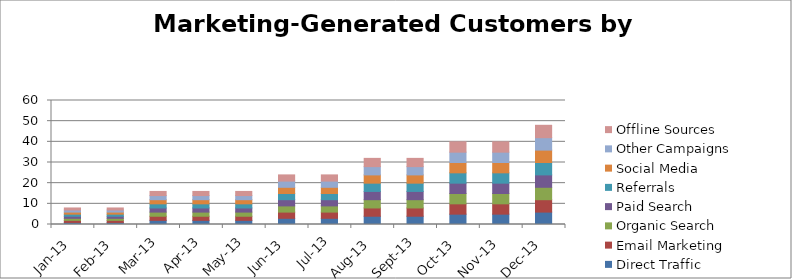
| Category | Direct Traffic | Email Marketing | Organic Search | Paid Search | Referrals | Social Media | Other Campaigns | Offline Sources |
|---|---|---|---|---|---|---|---|---|
| 2013-01-13 | 1 | 1 | 1 | 1 | 1 | 1 | 1 | 1 |
| 2013-02-13 | 1 | 1 | 1 | 1 | 1 | 1 | 1 | 1 |
| 2013-03-13 | 2 | 2 | 2 | 2 | 2 | 2 | 2 | 2 |
| 2013-04-13 | 2 | 2 | 2 | 2 | 2 | 2 | 2 | 2 |
| 2013-05-13 | 2 | 2 | 2 | 2 | 2 | 2 | 2 | 2 |
| 2013-06-13 | 3 | 3 | 3 | 3 | 3 | 3 | 3 | 3 |
| 2013-07-13 | 3 | 3 | 3 | 3 | 3 | 3 | 3 | 3 |
| 2013-08-13 | 4 | 4 | 4 | 4 | 4 | 4 | 4 | 4 |
| 2013-09-13 | 4 | 4 | 4 | 4 | 4 | 4 | 4 | 4 |
| 2013-10-13 | 5 | 5 | 5 | 5 | 5 | 5 | 5 | 5 |
| 2013-11-13 | 5 | 5 | 5 | 5 | 5 | 5 | 5 | 5 |
| 2013-12-13 | 6 | 6 | 6 | 6 | 6 | 6 | 6 | 6 |